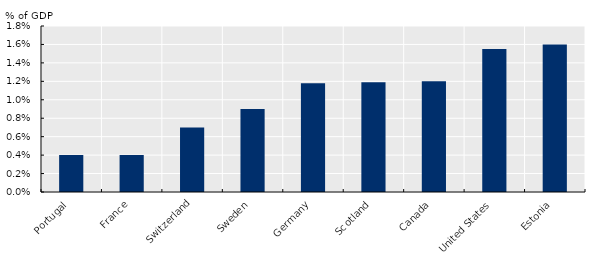
| Category | Series 0 |
|---|---|
| Portugal | 0.004 |
| France | 0.004 |
| Switzerland | 0.007 |
| Sweden | 0.009 |
| Germany | 0.012 |
| Scotland | 0.012 |
| Canada | 0.012 |
| United States | 0.016 |
| Estonia | 0.016 |